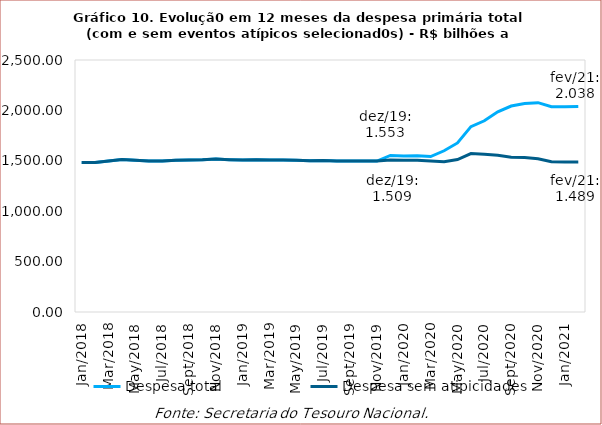
| Category | Despesa total | Despesa sem atipicidades |
|---|---|---|
| 2018-01-01 | 1484350.778 | 1484350.778 |
| 2018-02-01 | 1483704.597 | 1483704.597 |
| 2018-03-01 | 1498174.573 | 1498174.573 |
| 2018-04-01 | 1513695.206 | 1513695.206 |
| 2018-05-01 | 1504816.354 | 1504816.354 |
| 2018-06-01 | 1498281.892 | 1498281.892 |
| 2018-07-01 | 1498047.211 | 1498047.211 |
| 2018-08-01 | 1505032.623 | 1505032.623 |
| 2018-09-01 | 1507247.32 | 1507247.32 |
| 2018-10-01 | 1510212.153 | 1510212.153 |
| 2018-11-01 | 1516800.047 | 1516800.047 |
| 2018-12-01 | 1511331.574 | 1511331.574 |
| 2019-01-01 | 1508559.021 | 1508559.021 |
| 2019-02-01 | 1511110.246 | 1511110.246 |
| 2019-03-01 | 1506937.868 | 1506937.868 |
| 2019-04-01 | 1507569.455 | 1507569.455 |
| 2019-05-01 | 1505897.86 | 1505897.86 |
| 2019-06-01 | 1500973.254 | 1500973.254 |
| 2019-07-01 | 1503708.216 | 1503708.216 |
| 2019-08-01 | 1498282.244 | 1498282.244 |
| 2019-09-01 | 1498661.98 | 1498661.98 |
| 2019-10-01 | 1498636.929 | 1498636.929 |
| 2019-11-01 | 1497621.217 | 1497621.217 |
| 2019-12-01 | 1552695.607 | 1508521.447 |
| 2020-01-01 | 1548767.875 | 1504593.715 |
| 2020-02-01 | 1549295.862 | 1505121.564 |
| 2020-03-01 | 1542536.739 | 1497270.983 |
| 2020-04-01 | 1599551.148 | 1491643.164 |
| 2020-05-01 | 1676965.991 | 1512578.125 |
| 2020-06-01 | 1838863.045 | 1572255.147 |
| 2020-07-01 | 1896924.078 | 1564293.403 |
| 2020-08-01 | 1985572.029 | 1555233.487 |
| 2020-09-01 | 2043391.292 | 1536409.809 |
| 2020-10-01 | 2068671.798 | 1531778.774 |
| 2020-11-01 | 2076717.002 | 1520878.929 |
| 2020-12-01 | 2035733.249 | 1490158.171 |
| 2021-01-01 | 2035332.97 | 1487717.065 |
| 2021-02-01 | 2037963.63 | 1489286.563 |